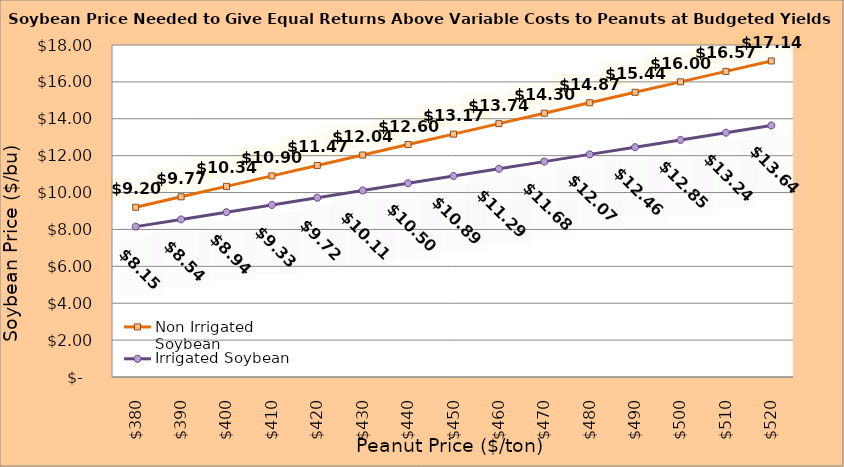
| Category | Non Irrigated Soybean | Irrigated Soybean |
|---|---|---|
| 380.0 | 9.203 | 8.153 |
| 390.0 | 9.769 | 8.544 |
| 400.0 | 10.336 | 8.936 |
| 410.0 | 10.903 | 9.328 |
| 420.0 | 11.469 | 9.719 |
| 430.0 | 12.036 | 10.111 |
| 440.0 | 12.603 | 10.503 |
| 450.0 | 13.169 | 10.894 |
| 460.0 | 13.736 | 11.286 |
| 470.0 | 14.303 | 11.678 |
| 480.0 | 14.869 | 12.069 |
| 490.0 | 15.436 | 12.461 |
| 500.0 | 16.003 | 12.853 |
| 510.0 | 16.569 | 13.244 |
| 520.0 | 17.136 | 13.636 |